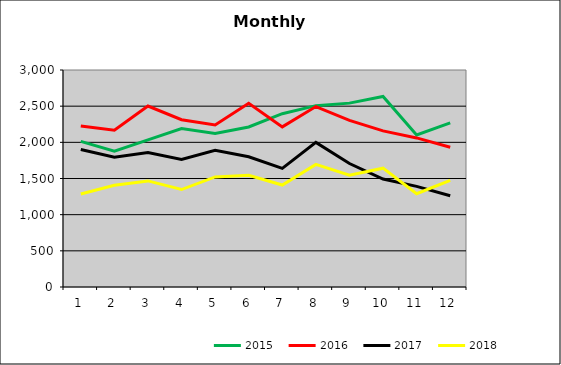
| Category | 2015 | 2016 | 2017 | 2018 |
|---|---|---|---|---|
| 0 | 2012.541 | 2226.188 | 1900.859 | 1286.21 |
| 1 | 1876.319 | 2166.497 | 1795.105 | 1406.556 |
| 2 | 2033.639 | 2501.903 | 1859.386 | 1466.695 |
| 3 | 2190.038 | 2312.349 | 1764.013 | 1347.408 |
| 4 | 2122.18 | 2240.561 | 1891.399 | 1522.181 |
| 5 | 2212.445 | 2540.235 | 1800.236 | 1543.945 |
| 6 | 2396.234 | 2213.485 | 1640.121 | 1409.491 |
| 7 | 2507.021 | 2494.361 | 1999.331 | 1694.901 |
| 8 | 2542.091 | 2304.009 | 1706.874 | 1545.104 |
| 9 | 2633.621 | 2158.544 | 1492.036 | 1642.816 |
| 10 | 2103.155 | 2060.966 | 1390.86 | 1288.934 |
| 11 | 2268.667 | 1932.97 | 1261.902 | 1474.68 |